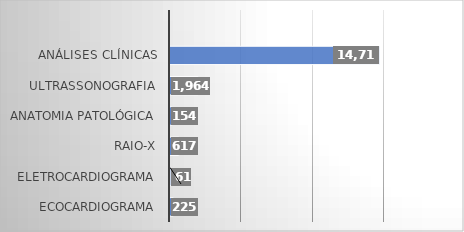
| Category | Series 0 |
|---|---|
| ECOCARDIOGRAMA | 225 |
| ELETROCARDIOGRAMA | 61 |
| RAIO-X | 617 |
| ANATOMIA PATOLÓGICA | 154 |
| ULTRASSONOGRAFIA | 1964 |
| ANÁLISES CLÍNICAS | 14715 |